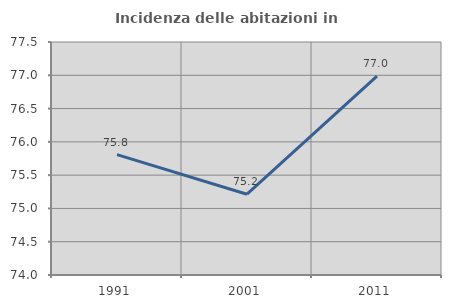
| Category | Incidenza delle abitazioni in proprietà  |
|---|---|
| 1991.0 | 75.808 |
| 2001.0 | 75.214 |
| 2011.0 | 76.987 |